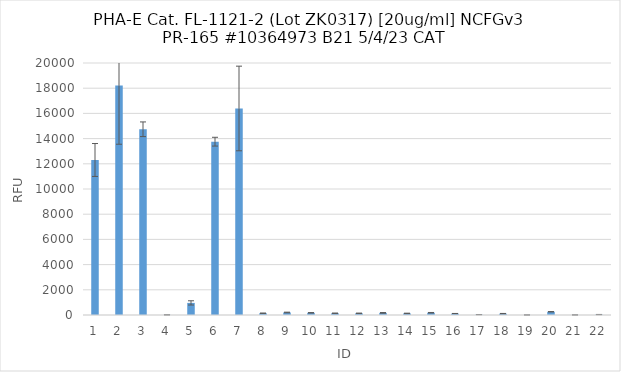
| Category | RFU |
|---|---|
| 0 | 12302.75 |
| 1 | 18212.75 |
| 2 | 14741.25 |
| 3 | 12.5 |
| 4 | 960.25 |
| 5 | 13755.5 |
| 6 | 16390.5 |
| 7 | 140.25 |
| 8 | 200.75 |
| 9 | 175 |
| 10 | 139.25 |
| 11 | 136.75 |
| 12 | 170 |
| 13 | 127 |
| 14 | 180.25 |
| 15 | 115.25 |
| 16 | 30.5 |
| 17 | 107.75 |
| 18 | 4.5 |
| 19 | 258.25 |
| 20 | 6.75 |
| 21 | 34.5 |